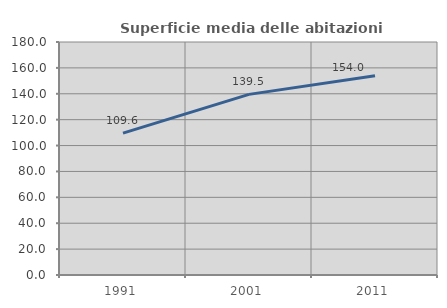
| Category | Superficie media delle abitazioni occupate |
|---|---|
| 1991.0 | 109.605 |
| 2001.0 | 139.528 |
| 2011.0 | 153.961 |